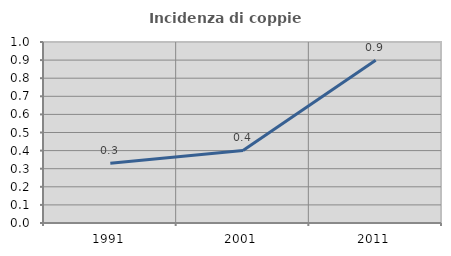
| Category | Incidenza di coppie miste |
|---|---|
| 1991.0 | 0.33 |
| 2001.0 | 0.401 |
| 2011.0 | 0.9 |